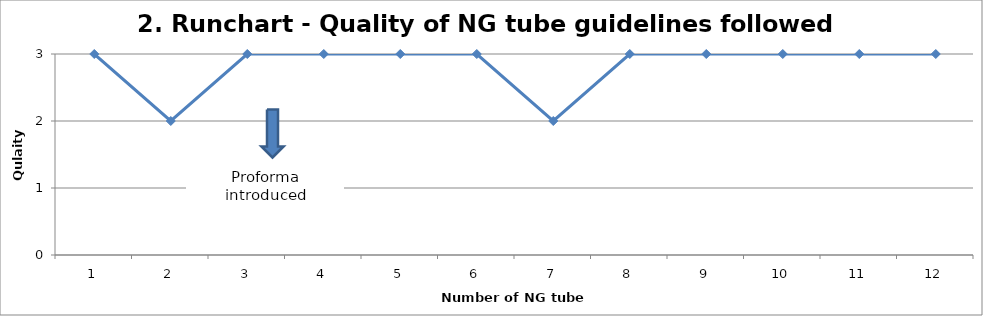
| Category | Series 0 |
|---|---|
| 0 | 3 |
| 1 | 2 |
| 2 | 3 |
| 3 | 3 |
| 4 | 3 |
| 5 | 3 |
| 6 | 2 |
| 7 | 3 |
| 8 | 3 |
| 9 | 3 |
| 10 | 3 |
| 11 | 3 |